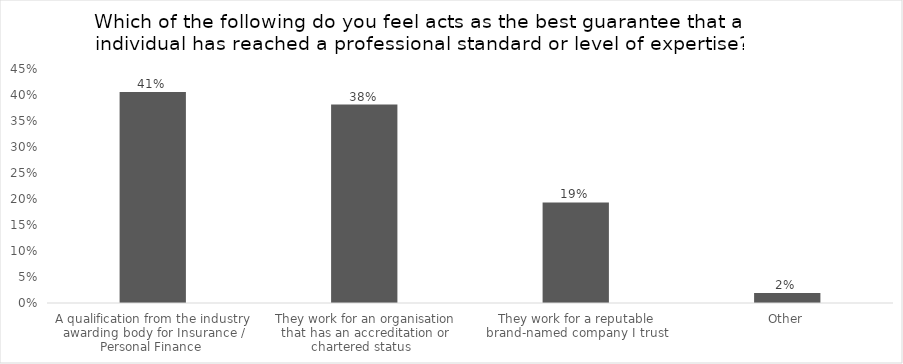
| Category | % of Respondents |
|---|---|
| A qualification from the industry awarding body for Insurance / Personal Finance  | 0.406 |
| They work for an organisation that has an accreditation or chartered status   | 0.382 |
| They work for a reputable brand-named company I trust | 0.193 |
| Other | 0.019 |